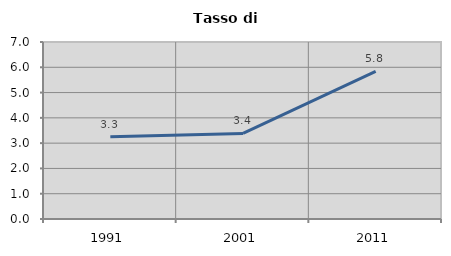
| Category | Tasso di disoccupazione   |
|---|---|
| 1991.0 | 3.252 |
| 2001.0 | 3.383 |
| 2011.0 | 5.838 |